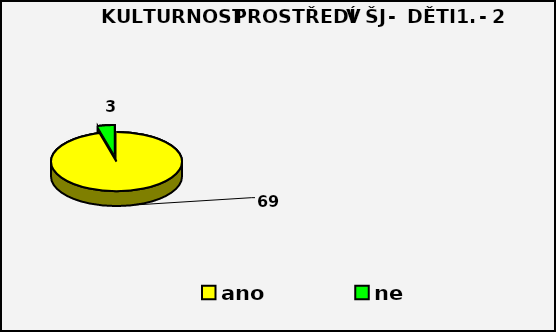
| Category | Series 0 |
|---|---|
| ano | 69 |
| ne  | 3 |